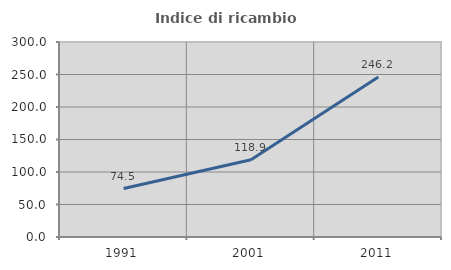
| Category | Indice di ricambio occupazionale  |
|---|---|
| 1991.0 | 74.488 |
| 2001.0 | 118.881 |
| 2011.0 | 246.154 |